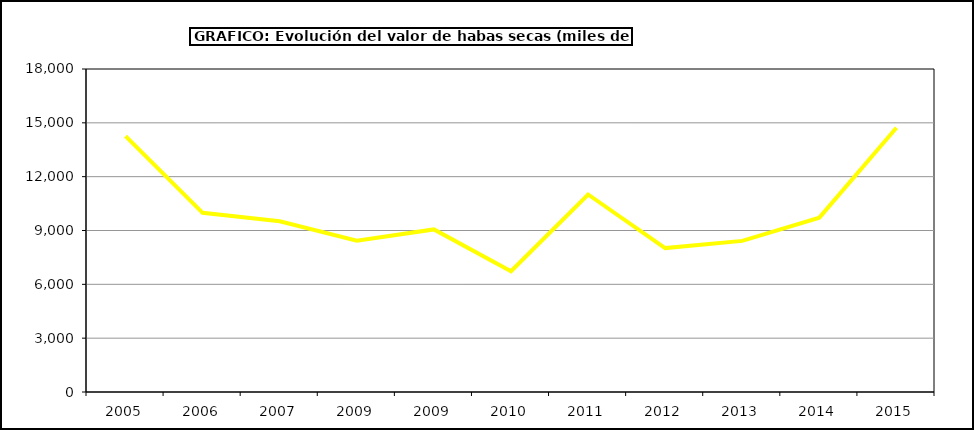
| Category | Valor |
|---|---|
| 2005.0 | 14263.015 |
| 2006.0 | 9984.231 |
| 2007.0 | 9511.634 |
| 2009.0 | 8432.078 |
| 2009.0 | 9059.237 |
| 2010.0 | 6730.947 |
| 2011.0 | 11007.809 |
| 2012.0 | 8020.102 |
| 2013.0 | 8422.081 |
| 2014.0 | 9715.78 |
| 2015.0 | 14725 |